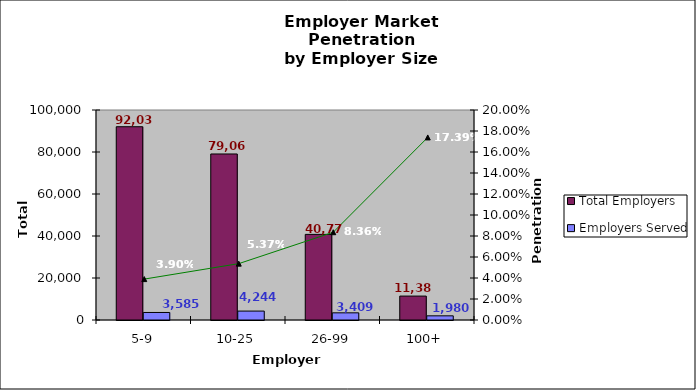
| Category | Total Employers | Employers Served |
|---|---|---|
| 5-9 | 92032 | 3585 |
| 10-25 | 79061 | 4244 |
| 26-99 | 40773 | 3409 |
| 100+ | 11387 | 1980 |